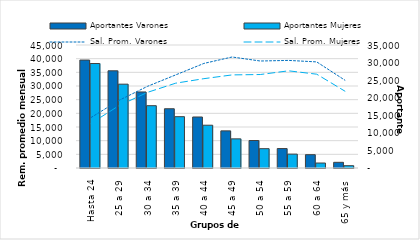
| Category | Aportantes Varones | Aportantes Mujeres |
|---|---|---|
| Hasta 24 | 30710 | 29730 |
| 25 a 29 | 27656 | 23857 |
| 30 a 34 | 21637 | 17731 |
| 35 a 39 | 16861 | 14603 |
| 40 a 44 | 14516 | 12174 |
| 45 a 49 | 10566 | 8294 |
| 50 a 54 | 7825 | 5498 |
| 55 a 59 | 5531 | 3950 |
| 60 a 64 | 3789 | 1415 |
| 65 y más | 1618 | 657 |